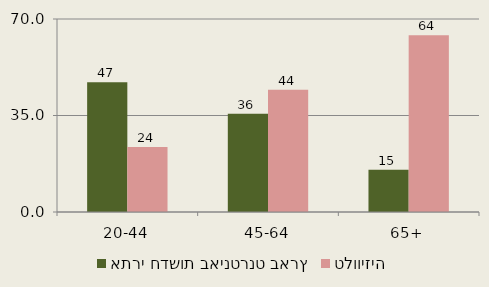
| Category | אתרי חדשות באינטרנט בארץ | טלוויזיה |
|---|---|---|
| 20-44 | 47.1 | 23.6 |
| 45-64 | 35.6 | 44.3 |
| 65+ | 15.3 | 64.1 |